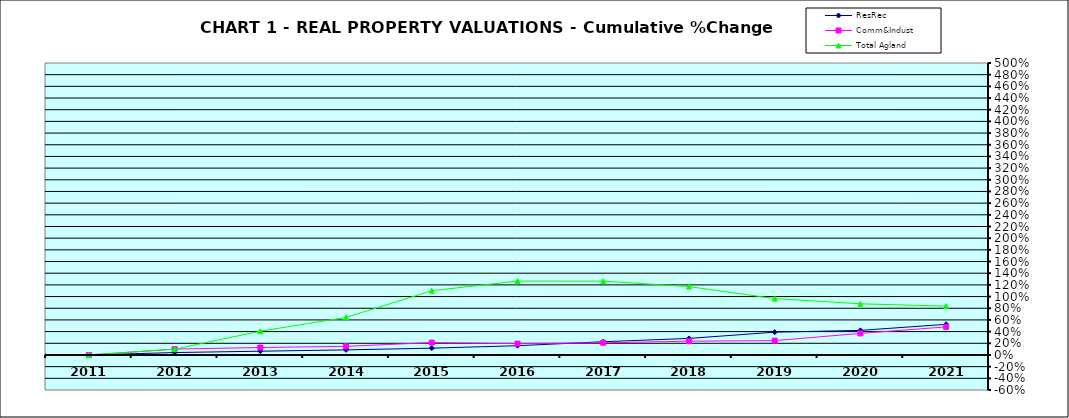
| Category | ResRec | Comm&Indust | Total Agland |
|---|---|---|---|
| 2011.0 | 0 | 0 | 0 |
| 2012.0 | 0.041 | 0.1 | 0.099 |
| 2013.0 | 0.065 | 0.128 | 0.407 |
| 2014.0 | 0.087 | 0.148 | 0.643 |
| 2015.0 | 0.117 | 0.212 | 1.1 |
| 2016.0 | 0.158 | 0.194 | 1.265 |
| 2017.0 | 0.227 | 0.209 | 1.264 |
| 2018.0 | 0.283 | 0.236 | 1.171 |
| 2019.0 | 0.39 | 0.245 | 0.966 |
| 2020.0 | 0.421 | 0.369 | 0.876 |
| 2021.0 | 0.524 | 0.481 | 0.836 |